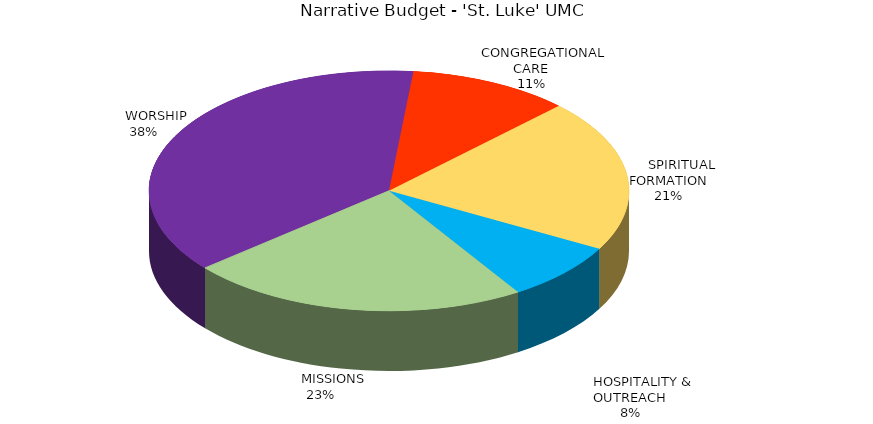
| Category | Series 0 |
|---|---|
|        WORSHIP | 62845.405 |
|        CONGREGATIONAL CARE | 18096.793 |
|        SPIRITUAL FORMATION | 34214.425 |
|        HOSPITALITY & OUTREACH | 13233.693 |
|        MISSIONS | 38173.683 |